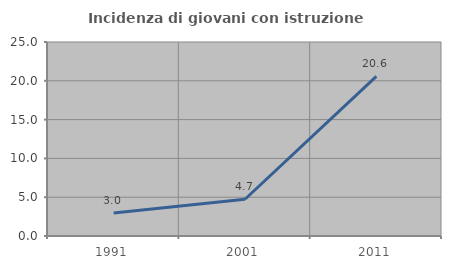
| Category | Incidenza di giovani con istruzione universitaria |
|---|---|
| 1991.0 | 2.976 |
| 2001.0 | 4.737 |
| 2011.0 | 20.567 |